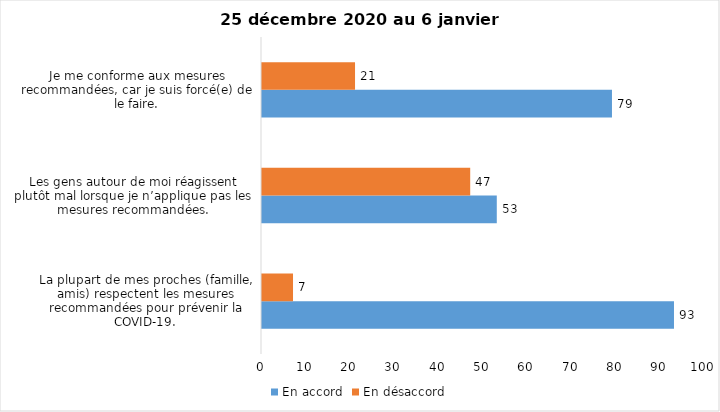
| Category | En accord | En désaccord |
|---|---|---|
| La plupart de mes proches (famille, amis) respectent les mesures recommandées pour prévenir la COVID-19. | 93 | 7 |
| Les gens autour de moi réagissent plutôt mal lorsque je n’applique pas les mesures recommandées. | 53 | 47 |
| Je me conforme aux mesures recommandées, car je suis forcé(e) de le faire. | 79 | 21 |